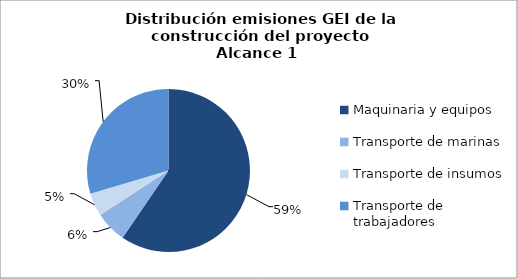
| Category | Series 0 |
|---|---|
| Maquinaria y equipos | 9779.56 |
| Transporte de marinas | 1029.284 |
| Transporte de insumos | 757.206 |
| Transporte de trabajadores | 4862.122 |